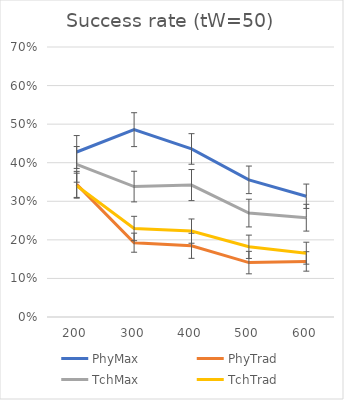
| Category | PhyMax | PhyTrad | TchMax | TchTrad |
|---|---|---|---|---|
| 200.0 | 0.428 | 0.344 | 0.396 | 0.34 |
| 300.0 | 0.486 | 0.193 | 0.338 | 0.229 |
| 400.0 | 0.436 | 0.185 | 0.342 | 0.223 |
| 500.0 | 0.356 | 0.141 | 0.269 | 0.182 |
| 600.0 | 0.313 | 0.144 | 0.257 | 0.165 |